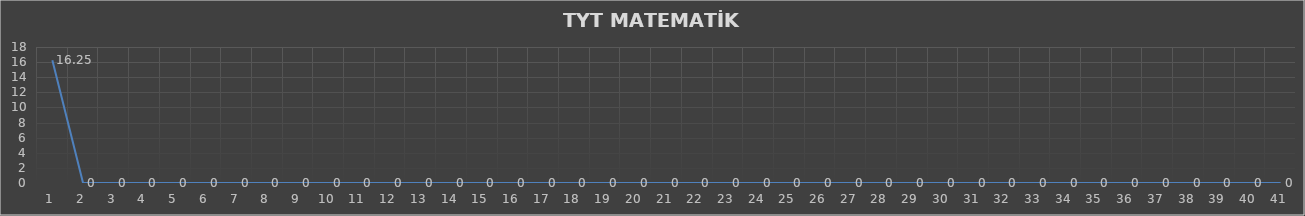
| Category | Series 0 |
|---|---|
| 0 | 16.25 |
| 1 | 0 |
| 2 | 0 |
| 3 | 0 |
| 4 | 0 |
| 5 | 0 |
| 6 | 0 |
| 7 | 0 |
| 8 | 0 |
| 9 | 0 |
| 10 | 0 |
| 11 | 0 |
| 12 | 0 |
| 13 | 0 |
| 14 | 0 |
| 15 | 0 |
| 16 | 0 |
| 17 | 0 |
| 18 | 0 |
| 19 | 0 |
| 20 | 0 |
| 21 | 0 |
| 22 | 0 |
| 23 | 0 |
| 24 | 0 |
| 25 | 0 |
| 26 | 0 |
| 27 | 0 |
| 28 | 0 |
| 29 | 0 |
| 30 | 0 |
| 31 | 0 |
| 32 | 0 |
| 33 | 0 |
| 34 | 0 |
| 35 | 0 |
| 36 | 0 |
| 37 | 0 |
| 38 | 0 |
| 39 | 0 |
| 40 | 0 |